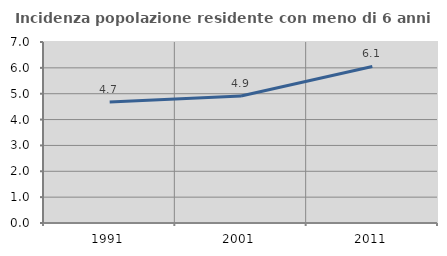
| Category | Incidenza popolazione residente con meno di 6 anni |
|---|---|
| 1991.0 | 4.678 |
| 2001.0 | 4.912 |
| 2011.0 | 6.056 |